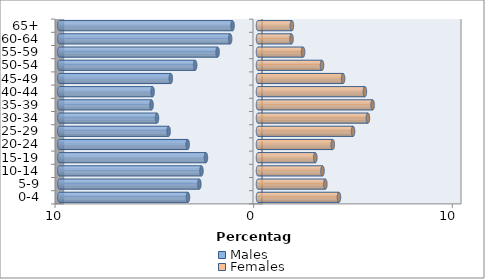
| Category | Males | Females |
|---|---|---|
| 0-4 | -3.526 | 4.075 |
| 5-9 | -2.951 | 3.39 |
| 10-14 | -2.847 | 3.247 |
| 15-19 | -2.621 | 2.885 |
| 20-24 | -3.539 | 3.762 |
| 25-29 | -4.5 | 4.785 |
| 30-34 | -5.085 | 5.534 |
| 35-39 | -5.36 | 5.77 |
| 40-44 | -5.304 | 5.381 |
| 45-49 | -4.389 | 4.284 |
| 50-54 | -3.164 | 3.223 |
| 55-59 | -2.033 | 2.269 |
| 60-64 | -1.403 | 1.688 |
| 65+ | -1.281 | 1.705 |